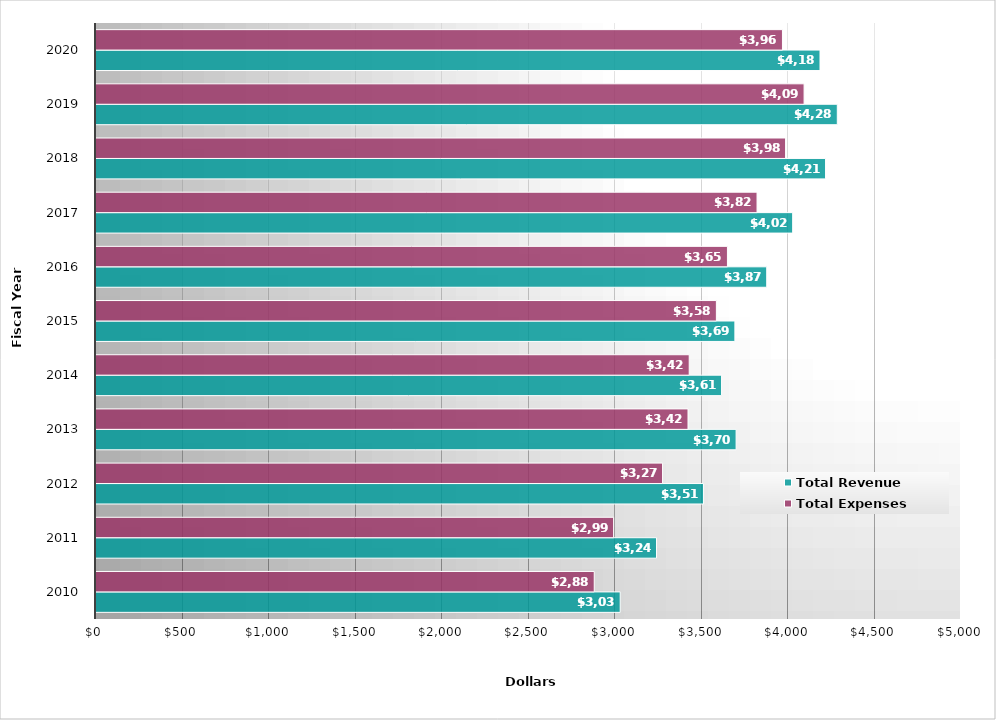
| Category | Total Revenue | Total Expenses |
|---|---|---|
| 2010.0 | 3030 | 2880 |
| 2011.0 | 3240 | 2992 |
| 2012.0 | 3512 | 3275 |
| 2013.0 | 3700 | 3422 |
| 2014.0 | 3616 | 3429 |
| 2015.0 | 3693 | 3586 |
| 2016.0 | 3877 | 3650 |
| 2017.0 | 4027 | 3821 |
| 2018.0 | 4217 | 3986 |
| 2019.0 | 4285 | 4093 |
| 2020.0 | 4185 | 3968 |